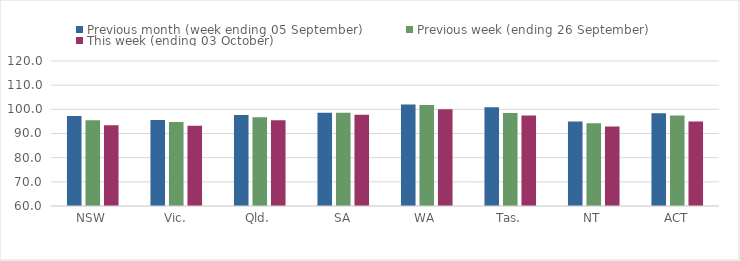
| Category | Previous month (week ending 05 September) | Previous week (ending 26 September) | This week (ending 03 October) |
|---|---|---|---|
| NSW | 97.24 | 95.45 | 93.41 |
| Vic. | 95.56 | 94.79 | 93.17 |
| Qld. | 97.67 | 96.75 | 95.5 |
| SA | 98.61 | 98.63 | 97.74 |
| WA | 102.01 | 101.83 | 100.02 |
| Tas. | 100.83 | 98.44 | 97.41 |
| NT | 94.95 | 94.22 | 92.93 |
| ACT | 98.38 | 97.5 | 94.94 |